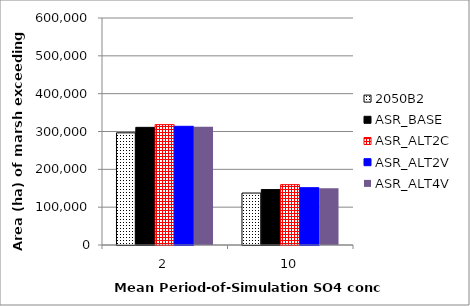
| Category | 2050B2 | ASR_BASE | ASR_ALT2C | ASR_ALT2V | ASR_ALT4V |
|---|---|---|---|---|---|
| 2.0 | 296475 | 310950 | 318175 | 313725 | 312600 |
| 10.0 | 137350 | 146475 | 159550 | 151500 | 149850 |